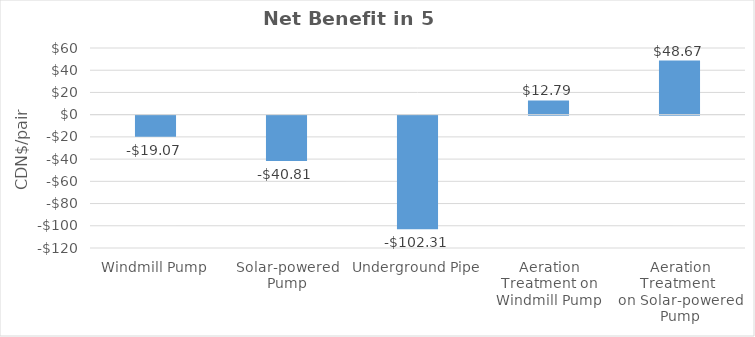
| Category | Net Benefits in 5 Year
($/head) |
|---|---|
| Windmill Pump | -19.073 |
| Solar-powered Pump | -40.814 |
| Underground Pipe | -102.314 |
| Aeration Treatment on Windmill Pump | 12.794 |
| Aeration Treatment 
on Solar-powered Pump | 48.669 |